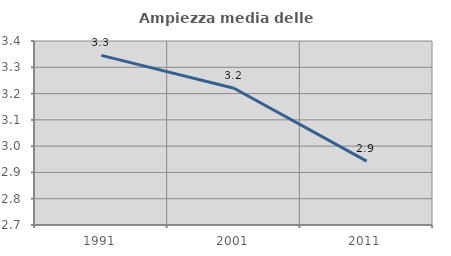
| Category | Ampiezza media delle famiglie |
|---|---|
| 1991.0 | 3.345 |
| 2001.0 | 3.22 |
| 2011.0 | 2.943 |